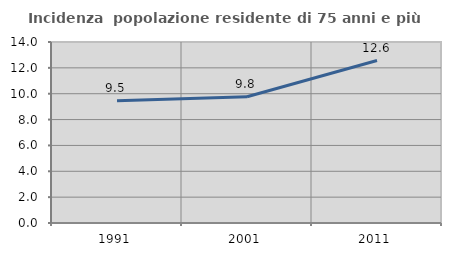
| Category | Incidenza  popolazione residente di 75 anni e più |
|---|---|
| 1991.0 | 9.451 |
| 2001.0 | 9.769 |
| 2011.0 | 12.566 |